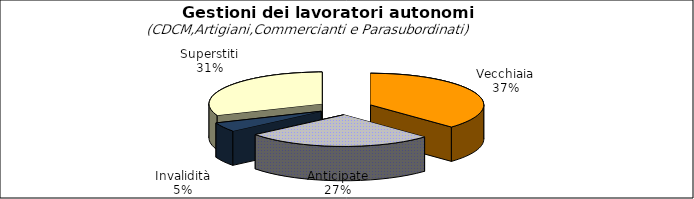
| Category | Series 0 |
|---|---|
| Vecchiaia | 43231 |
| Anticipate | 31186 |
| Invalidità | 5459 |
| Superstiti | 35914 |